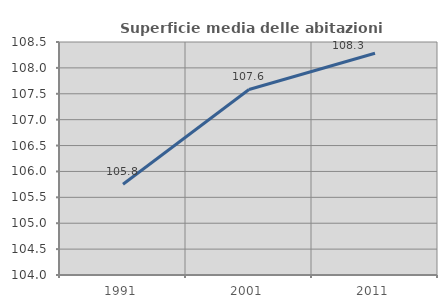
| Category | Superficie media delle abitazioni occupate |
|---|---|
| 1991.0 | 105.753 |
| 2001.0 | 107.584 |
| 2011.0 | 108.283 |